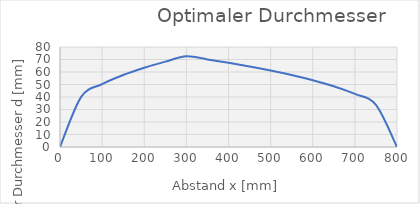
| Category | Series 0 |
|---|---|
| 0.0 | 0 |
| 50.0 | 39.936 |
| 100.0 | 50.316 |
| 150.0 | 57.598 |
| 200.0 | 63.395 |
| 250.0 | 68.29 |
| 300.0 | 72.569 |
| 350.0 | 70.065 |
| 400.0 | 67.367 |
| 450.0 | 64.434 |
| 500.0 | 61.207 |
| 550.0 | 57.598 |
| 600.0 | 53.469 |
| 650.0 | 48.58 |
| 700.0 | 42.439 |
| 750.0 | 33.683 |
| 800.0 | 0 |